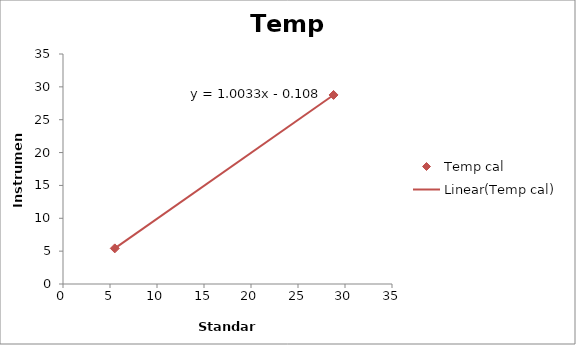
| Category | Temp cal |
|---|---|
| 28.78 | 28.766 |
| 5.51 | 5.42 |